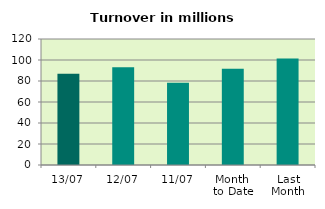
| Category | Series 0 |
|---|---|
| 13/07 | 86.801 |
| 12/07 | 93.117 |
| 11/07 | 78.256 |
| Month 
to Date | 91.703 |
| Last
Month | 101.544 |